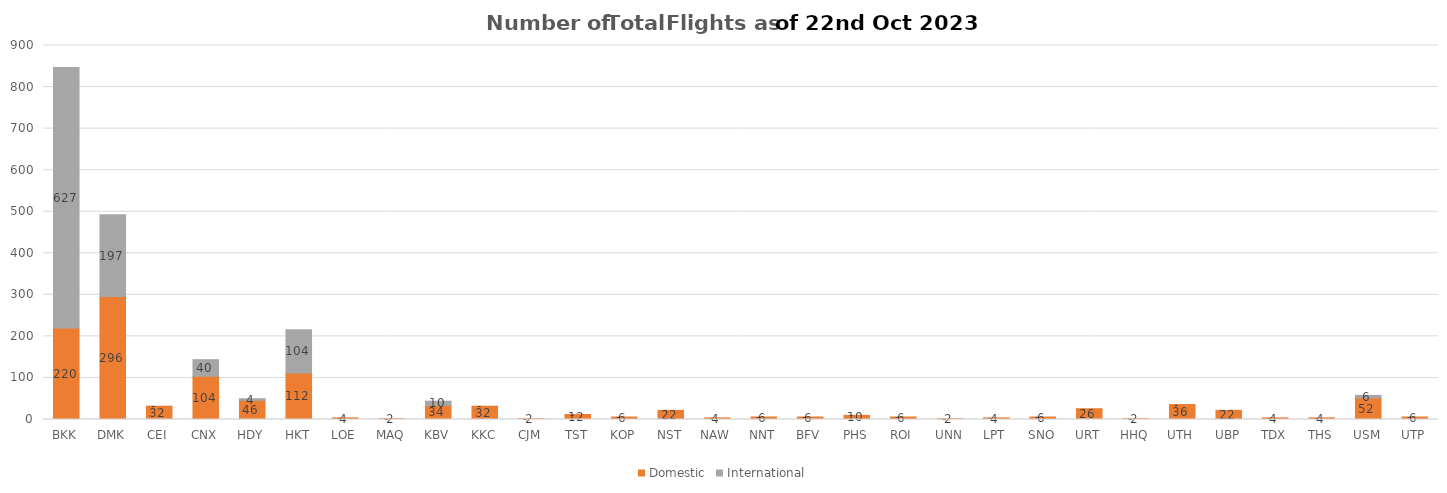
| Category | Domestic | International |
|---|---|---|
| BKK | 220 | 627 |
| DMK | 296 | 197 |
| CEI | 32 | 0 |
| CNX | 104 | 40 |
| HDY | 46 | 4 |
| HKT | 112 | 104 |
| LOE | 4 | 0 |
| MAQ | 2 | 0 |
| KBV | 34 | 10 |
| KKC | 32 | 0 |
| CJM | 2 | 0 |
| TST | 12 | 0 |
| KOP | 6 | 0 |
| NST | 22 | 0 |
| NAW | 4 | 0 |
| NNT | 6 | 0 |
| BFV | 6 | 0 |
| PHS | 10 | 0 |
| ROI | 6 | 0 |
| UNN | 2 | 0 |
| LPT | 4 | 0 |
| SNO | 6 | 0 |
| URT | 26 | 0 |
| HHQ | 2 | 0 |
| UTH | 36 | 0 |
| UBP | 22 | 0 |
| TDX | 4 | 0 |
| THS | 4 | 0 |
| USM | 52 | 6 |
| UTP | 6 | 0 |